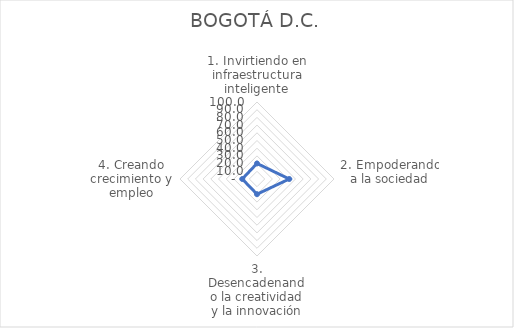
| Category | BOGOTÁ D.C. |
|---|---|
| 1. Invirtiendo en infraestructura inteligente | 20.218 |
| 2. Empoderando a la sociedad | 41.857 |
| 3. Desencadenando la creatividad y la innovación | 19.758 |
| 4. Creando crecimiento y empleo | 19.133 |